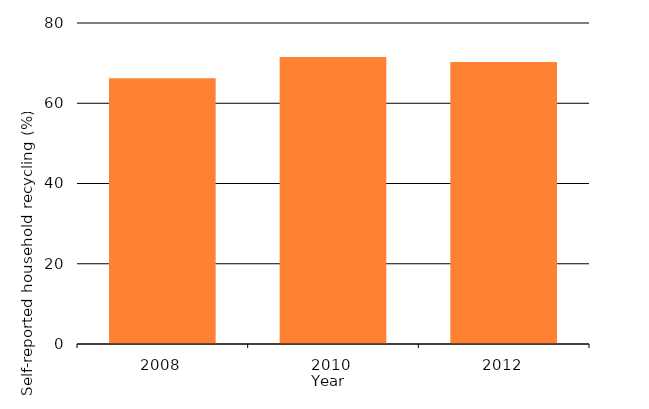
| Category | Self-reported household recycling (%) |
|---|---|
| 2008.0 | 66.2 |
| 2010.0 | 71.5 |
| 2012.0 | 70.3 |